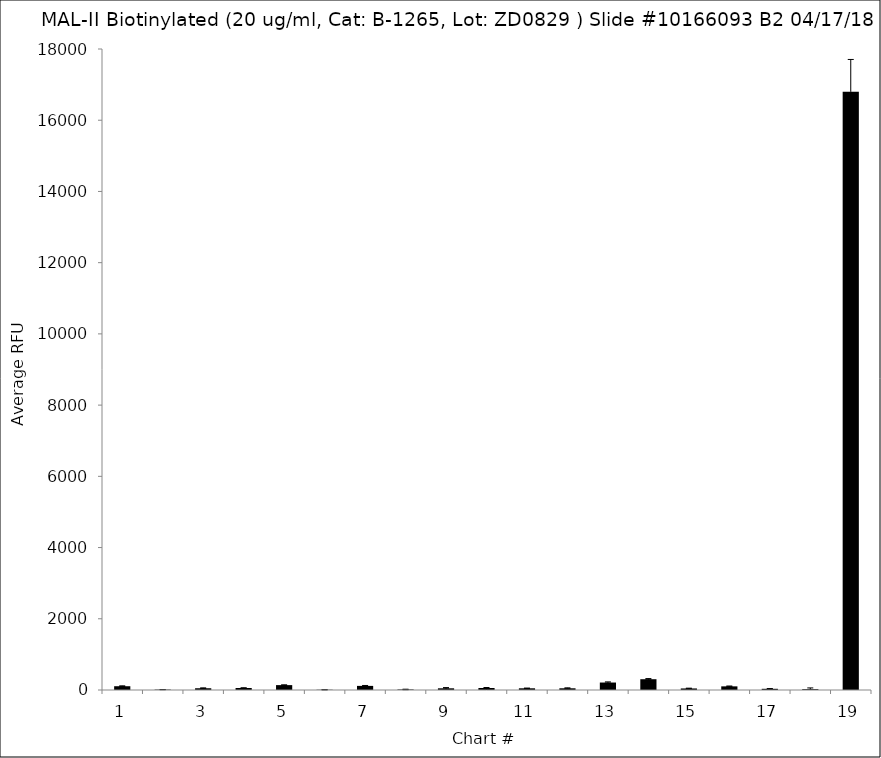
| Category | Series 0 |
|---|---|
| 1.0 | 106 |
| 2.0 | 11 |
| 3.0 | 49.25 |
| 4.0 | 56.75 |
| 5.0 | 137.25 |
| 6.0 | 7 |
| 7.0 | 115.5 |
| 8.0 | 15 |
| 9.0 | 47.5 |
| 10.0 | 57 |
| 11.0 | 47.75 |
| 12.0 | 48 |
| 13.0 | 209.75 |
| 14.0 | 302.75 |
| 15.0 | 43.5 |
| 16.0 | 102.25 |
| 17.0 | 33.75 |
| 18.0 | 24.5 |
| 19.0 | 16802.75 |